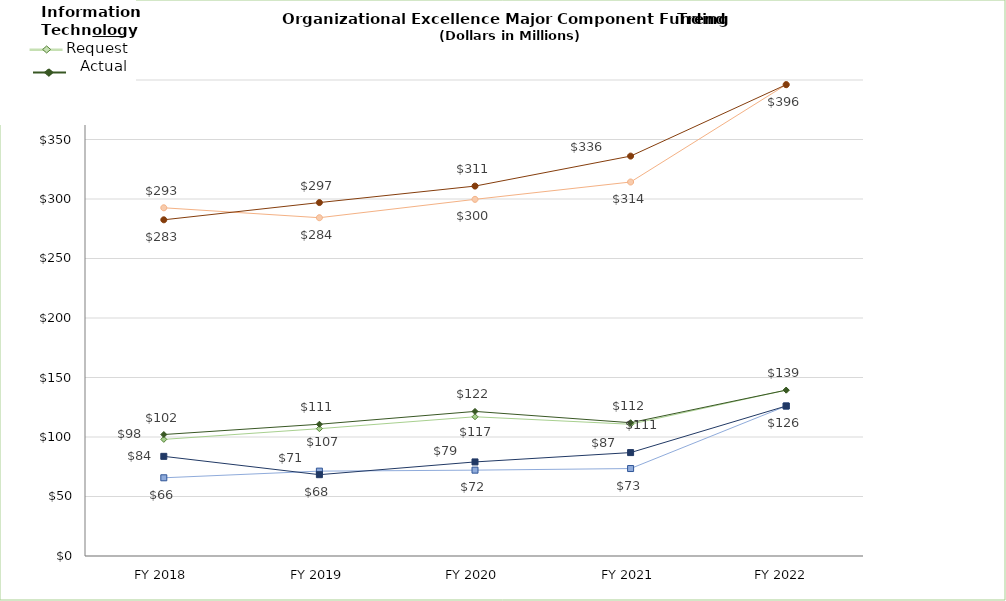
| Category | Human Capital Request | Human Capital Actual | IT Request | IT Actual | Admin Support Request | Admins Support Actual |
|---|---|---|---|---|---|---|
| FY 2018 | 292.618 | 282.521 | 98.003 | 102.076 | 65.727 | 83.734 |
| FY 2019 | 284.27 | 296.996 | 107 | 110.725 | 71.316 | 68.332 |
| FY 2020 | 299.715 | 310.851 | 117 | 121.501 | 72.146 | 79.05 |
| FY 2021 | 314.276 | 336.046 | 110.702 | 112.01 | 73.496 | 86.897 |
| FY 2022  | 396.078 | 396.078 | 139.39 | 139.39 | 126.042 | 126.042 |